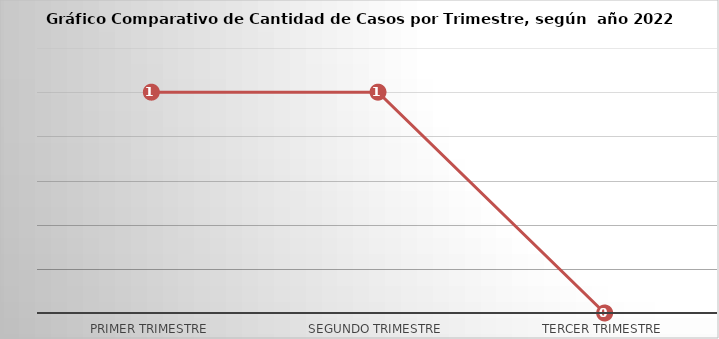
| Category | Series 0 |
|---|---|
| Primer Trimestre | 1 |
| Segundo Trimestre | 1 |
| Tercer Trimestre | 0 |